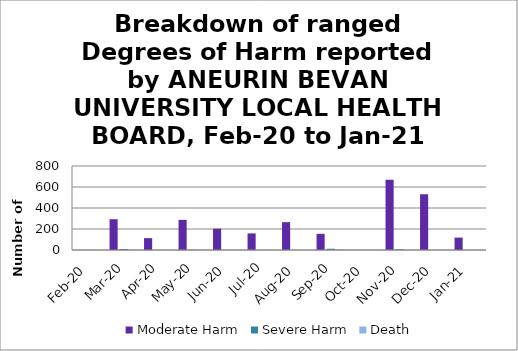
| Category | Moderate Harm | Severe Harm | Death |
|---|---|---|---|
| Feb-20 | 0 | 0 | 0 |
| Mar-20 | 293 | 10 | 3 |
| Apr-20 | 113 | 0 | 0 |
| May-20 | 287 | 3 | 5 |
| Jun-20 | 203 | 0 | 0 |
| Jul-20 | 158 | 0 | 0 |
| Aug-20 | 265 | 0 | 0 |
| Sep-20 | 154 | 12 | 9 |
| Oct-20 | 0 | 0 | 0 |
| Nov-20 | 669 | 8 | 0 |
| Dec-20 | 531 | 0 | 0 |
| Jan-21 | 118 | 0 | 0 |